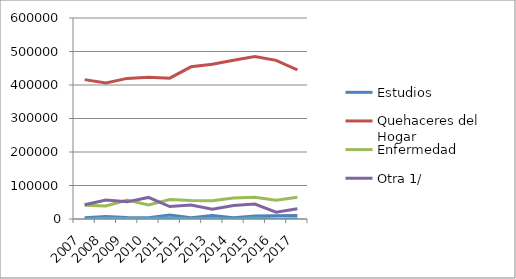
| Category | Estudios | Quehaceres del Hogar | Enfermedad | Otra 1/ | No Especificadas |
|---|---|---|---|---|---|
| 2007.0 | 3918 | 416071 | 41345 | 42289 | 0 |
| 2008.0 | 7738 | 405720 | 38862 | 56853 | 1983 |
| 2009.0 | 4614 | 419691 | 56743 | 51169 | 1201 |
| 2010.0 | 3529 | 423214 | 41993 | 64409 | 1304 |
| 2011.0 | 11927 | 420525 | 57911 | 37198 | 2832 |
| 2012.0 | 4070 | 454238 | 55251 | 41799 | 810 |
| 2013.0 | 10718 | 461701 | 54575 | 29459 | 1232 |
| 2014.0 | 4054 | 474110 | 62933 | 40203 | 0 |
| 2015.0 | 8690 | 484707 | 64693 | 44481 | 3065 |
| 2016.0 | 9855 | 473540 | 56232 | 20283 | 216 |
| 2017.0 | 10543 | 445397 | 64674 | 30671 | 476 |